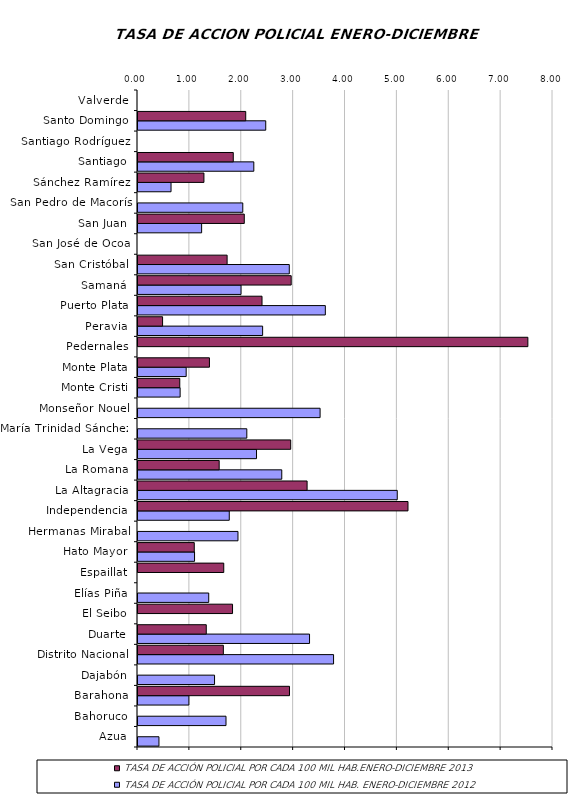
| Category | TASA DE ACCIÓN POLICIAL POR CADA 100 MIL HAB. ENERO-DICIEMBRE 2012 | TASA DE ACCIÓN POLICIAL POR CADA 100 MIL HAB.ENERO-DICIEMBRE 2013 |
|---|---|---|
| Azua | 0.404 | 0 |
| Bahoruco | 1.697 | 0 |
| Barahona | 0.981 | 2.921 |
| Dajabón | 1.476 | 0 |
| Distrito Nacional | 3.77 | 1.645 |
| Duarte | 3.307 | 1.316 |
| El Seibo | 0 | 1.823 |
| Elías Piña | 1.363 | 0 |
| Espaillat | 0 | 1.653 |
| Hato Mayor | 1.09 | 1.085 |
| Hermanas Mirabal | 1.927 | 0 |
| Independencia | 1.759 | 5.205 |
| La Altagracia | 4.998 | 3.26 |
| La Romana | 2.772 | 1.565 |
| La Vega | 2.285 | 2.944 |
| María Trinidad Sánchez | 2.098 | 0 |
| Monseñor Nouel | 3.51 | 0 |
| Monte Cristi | 0.812 | 0.805 |
| Monte Plata | 0.929 | 1.377 |
| Pedernales | 0 | 7.515 |
| Peravia | 2.403 | 0.474 |
| Puerto Plata | 3.611 | 2.391 |
| Samaná | 1.986 | 2.953 |
| San Cristóbal | 2.916 | 1.718 |
| San José de Ocoa | 0 | 0 |
| San Juan | 1.227 | 2.049 |
| San Pedro de Macorís | 2.02 | 0 |
| Sánchez Ramírez | 0.637 | 1.271 |
| Santiago | 2.233 | 1.837 |
| Santiago Rodríguez | 0 | 0 |
| Santo Domingo | 2.463 | 2.077 |
| Valverde | 0 | 0 |